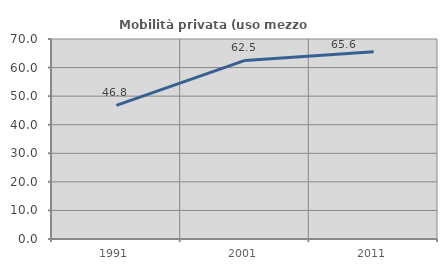
| Category | Mobilità privata (uso mezzo privato) |
|---|---|
| 1991.0 | 46.769 |
| 2001.0 | 62.5 |
| 2011.0 | 65.565 |